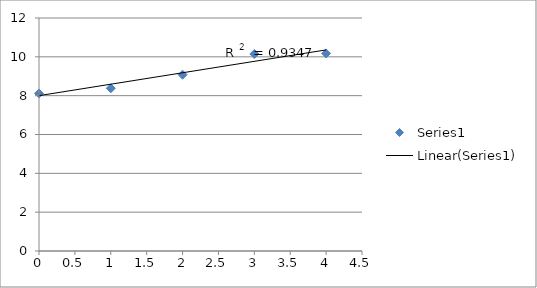
| Category | Series 0 |
|---|---|
| 0.0 | 8.114 |
| 1.0 | 8.38 |
| 2.0 | 9.079 |
| 3.0 | 10.146 |
| 4.0 | 10.176 |